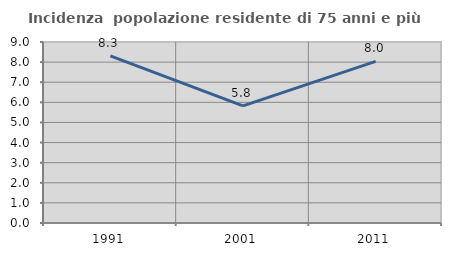
| Category | Incidenza  popolazione residente di 75 anni e più |
|---|---|
| 1991.0 | 8.311 |
| 2001.0 | 5.824 |
| 2011.0 | 8.033 |